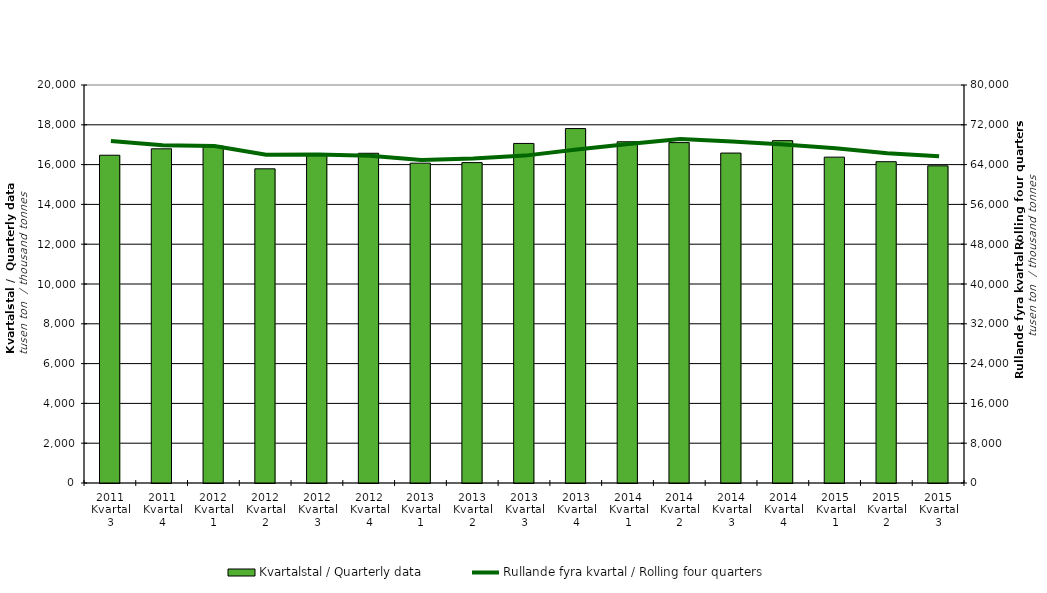
| Category | Kvartalstal / Quarterly data |
|---|---|
| 2011 Kvartal 3 | 16470.515 |
| 2011 Kvartal 4 | 16793.814 |
| 2012 Kvartal 1 | 16927.735 |
| 2012 Kvartal 2 | 15787.924 |
| 2012 Kvartal 3 | 16503.474 |
| 2012 Kvartal 4 | 16569.563 |
| 2013 Kvartal 1 | 16072.217 |
| 2013 Kvartal 2 | 16100.045 |
| 2013 Kvartal 3 | 17062.958 |
| 2013 Kvartal 4 | 17811.357 |
| 2014 Kvartal 1 | 17146.805 |
| 2014 Kvartal 2 | 17105.179 |
| 2014 Kvartal 3 | 16579.663 |
| 2014 Kvartal 4 | 17203.242 |
| 2015 Kvartal 1 | 16374.41 |
| 2015 Kvartal 2 | 16146.203 |
| 2015 Kvartal 3 | 15937.645 |